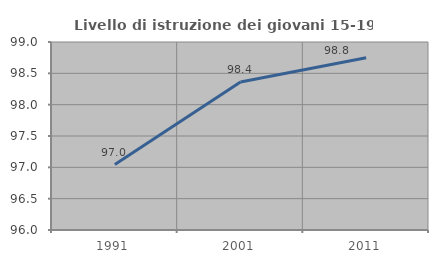
| Category | Livello di istruzione dei giovani 15-19 anni |
|---|---|
| 1991.0 | 97.044 |
| 2001.0 | 98.361 |
| 2011.0 | 98.75 |